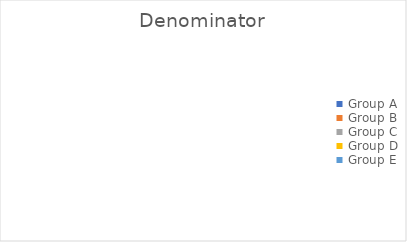
| Category |  Denominator  |
|---|---|
| Group A | 0 |
| Group B | 0 |
| Group C | 0 |
| Group D | 0 |
| Group E | 0 |